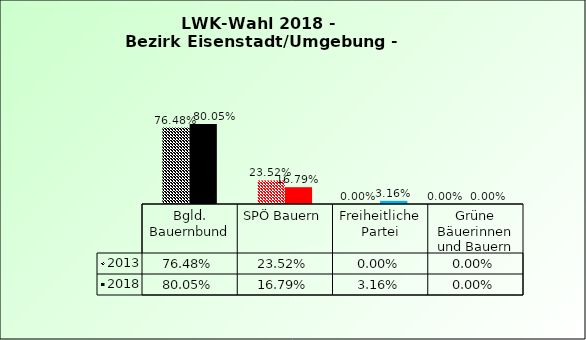
| Category | 2013 | 2018 |
|---|---|---|
| Bgld. Bauernbund | 0.765 | 0.8 |
| SPÖ Bauern | 0.235 | 0.168 |
| Freiheitliche Partei | 0 | 0.032 |
| Grüne Bäuerinnen und Bauern | 0 | 0 |